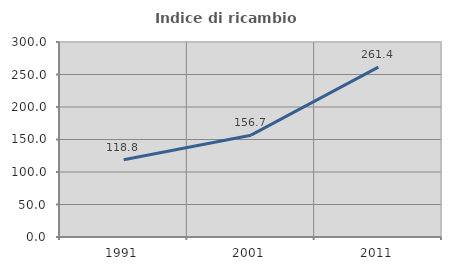
| Category | Indice di ricambio occupazionale  |
|---|---|
| 1991.0 | 118.818 |
| 2001.0 | 156.659 |
| 2011.0 | 261.398 |